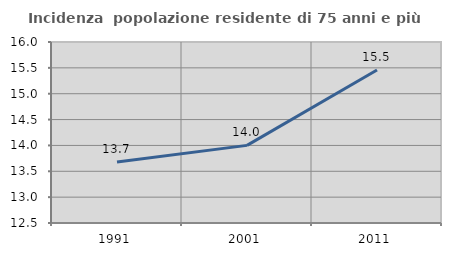
| Category | Incidenza  popolazione residente di 75 anni e più |
|---|---|
| 1991.0 | 13.678 |
| 2001.0 | 14.001 |
| 2011.0 | 15.459 |